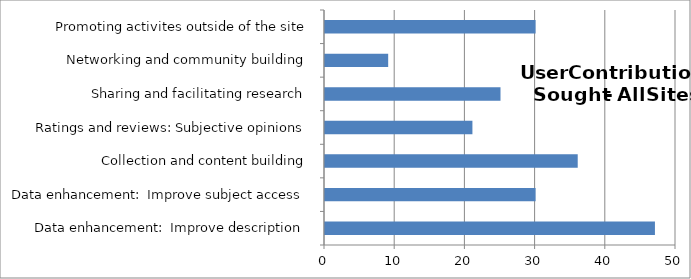
| Category | Series 0 |
|---|---|
| Data enhancement:  Improve description | 47 |
| Data enhancement:  Improve subject access | 30 |
| Collection and content building | 36 |
| Ratings and reviews: Subjective opinions | 21 |
| Sharing and facilitating research | 25 |
| Networking and community building | 9 |
| Promoting activites outside of the site | 30 |